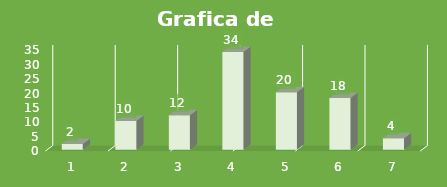
| Category | Series 0 |
|---|---|
| 0 | 2 |
| 1 | 10 |
| 2 | 12 |
| 3 | 34 |
| 4 | 20 |
| 5 | 18 |
| 6 | 4 |